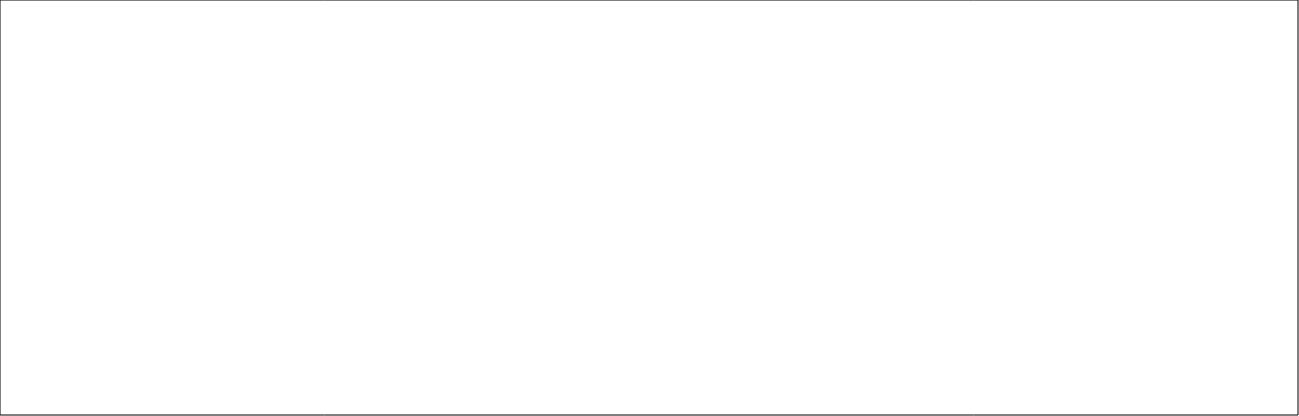
| Category | Sum of Mean |
|---|---|
| Adequate Experience | 78.4 |
| Clinical Supervision | 91.15 |
| Clinical Supervision out of hours | 89.15 |
| Curriculum Coverage | 76.77 |
| Educational Governance | 71.96 |
| Educational Supervision | 83.39 |
| Feedback | 71.16 |
| Handover | 65.58 |
| Induction | 78.41 |
| Local Teaching | 68.59 |
| Overall Satisfaction | 78.13 |
| Regional Teaching | 66.45 |
| Reporting systems | 73.58 |
| Rota Design | 55.08 |
| Study Leave | 62.89 |
| Supportive environment | 70.54 |
| Teamwork | 72.8 |
| Work Load | 45.87 |